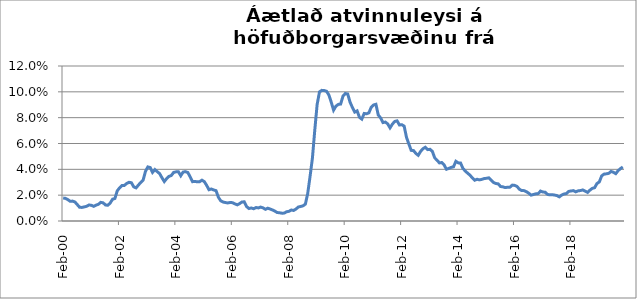
| Category | Series 0 |
|---|---|
| 2000-02-01 | 0.018 |
| 2000-03-01 | 0.018 |
| 2000-04-01 | 0.017 |
| 2000-05-01 | 0.015 |
| 2000-06-01 | 0.015 |
| 2000-07-01 | 0.015 |
| 2000-08-01 | 0.013 |
| 2000-09-01 | 0.011 |
| 2000-10-01 | 0.011 |
| 2000-11-01 | 0.011 |
| 2000-12-01 | 0.011 |
| 2001-01-01 | 0.012 |
| 2001-02-01 | 0.012 |
| 2001-03-01 | 0.011 |
| 2001-04-01 | 0.012 |
| 2001-05-01 | 0.013 |
| 2001-06-01 | 0.014 |
| 2001-07-01 | 0.014 |
| 2001-08-01 | 0.012 |
| 2001-09-01 | 0.012 |
| 2001-10-01 | 0.014 |
| 2001-11-01 | 0.017 |
| 2001-12-01 | 0.017 |
| 2002-01-01 | 0.023 |
| 2002-02-01 | 0.026 |
| 2002-03-01 | 0.028 |
| 2002-04-01 | 0.028 |
| 2002-05-01 | 0.029 |
| 2002-06-01 | 0.03 |
| 2002-07-01 | 0.03 |
| 2002-08-01 | 0.026 |
| 2002-09-01 | 0.026 |
| 2002-10-01 | 0.028 |
| 2002-11-01 | 0.03 |
| 2002-12-01 | 0.032 |
| 2003-01-01 | 0.038 |
| 2003-02-01 | 0.042 |
| 2003-03-01 | 0.041 |
| 2003-04-01 | 0.038 |
| 2003-05-01 | 0.04 |
| 2003-06-01 | 0.038 |
| 2003-07-01 | 0.037 |
| 2003-08-01 | 0.034 |
| 2003-09-01 | 0.031 |
| 2003-10-01 | 0.033 |
| 2003-11-01 | 0.035 |
| 2003-12-01 | 0.035 |
| 2004-01-01 | 0.038 |
| 2004-02-01 | 0.038 |
| 2004-03-01 | 0.038 |
| 2004-04-01 | 0.035 |
| 2004-05-01 | 0.038 |
| 2004-06-01 | 0.038 |
| 2004-07-01 | 0.038 |
| 2004-08-01 | 0.034 |
| 2004-09-01 | 0.03 |
| 2004-10-01 | 0.031 |
| 2004-11-01 | 0.03 |
| 2004-12-01 | 0.03 |
| 2005-01-01 | 0.032 |
| 2005-02-01 | 0.031 |
| 2005-03-01 | 0.028 |
| 2005-04-01 | 0.024 |
| 2005-05-01 | 0.025 |
| 2005-06-01 | 0.024 |
| 2005-07-01 | 0.024 |
| 2005-08-01 | 0.018 |
| 2005-09-01 | 0.016 |
| 2005-10-01 | 0.015 |
| 2005-11-01 | 0.014 |
| 2005-12-01 | 0.014 |
| 2006-01-01 | 0.014 |
| 2006-02-01 | 0.014 |
| 2006-03-01 | 0.013 |
| 2006-04-01 | 0.013 |
| 2006-05-01 | 0.013 |
| 2006-06-01 | 0.015 |
| 2006-07-01 | 0.015 |
| 2006-08-01 | 0.011 |
| 2006-09-01 | 0.01 |
| 2006-10-01 | 0.01 |
| 2006-11-01 | 0.01 |
| 2006-12-01 | 0.01 |
| 2007-01-01 | 0.01 |
| 2007-02-01 | 0.011 |
| 2007-03-01 | 0.01 |
| 2007-04-01 | 0.009 |
| 2007-05-01 | 0.01 |
| 2007-06-01 | 0.009 |
| 2007-07-01 | 0.009 |
| 2007-08-01 | 0.008 |
| 2007-09-01 | 0.007 |
| 2007-10-01 | 0.006 |
| 2007-11-01 | 0.006 |
| 2007-12-01 | 0.006 |
| 2008-01-01 | 0.007 |
| 2008-02-01 | 0.007 |
| 2008-03-01 | 0.009 |
| 2008-04-01 | 0.008 |
| 2008-05-01 | 0.009 |
| 2008-06-01 | 0.011 |
| 2008-07-01 | 0.011 |
| 2008-08-01 | 0.012 |
| 2008-09-01 | 0.013 |
| 2008-10-01 | 0.021 |
| 2008-11-01 | 0.035 |
| 2008-12-01 | 0.049 |
| 2009-01-01 | 0.07 |
| 2009-02-01 | 0.09 |
| 2009-03-01 | 0.1 |
| 2009-04-01 | 0.101 |
| 2009-05-01 | 0.101 |
| 2009-06-01 | 0.1 |
| 2009-07-01 | 0.098 |
| 2009-08-01 | 0.092 |
| 2009-09-01 | 0.086 |
| 2009-10-01 | 0.089 |
| 2009-11-01 | 0.09 |
| 2009-12-01 | 0.091 |
| 2010-01-01 | 0.097 |
| 2010-02-01 | 0.099 |
| 2010-03-01 | 0.098 |
| 2010-04-01 | 0.092 |
| 2010-05-01 | 0.088 |
| 2010-06-01 | 0.084 |
| 2010-07-01 | 0.085 |
| 2010-08-01 | 0.08 |
| 2010-09-01 | 0.079 |
| 2010-10-01 | 0.083 |
| 2010-11-01 | 0.083 |
| 2010-12-01 | 0.084 |
| 2011-01-01 | 0.088 |
| 2011-02-01 | 0.09 |
| 2011-03-01 | 0.09 |
| 2011-04-01 | 0.082 |
| 2011-05-01 | 0.08 |
| 2011-06-01 | 0.076 |
| 2011-07-01 | 0.077 |
| 2011-08-01 | 0.075 |
| 2011-09-01 | 0.072 |
| 2011-10-01 | 0.075 |
| 2011-11-01 | 0.077 |
| 2011-12-01 | 0.078 |
| 2012-01-01 | 0.074 |
| 2012-02-01 | 0.075 |
| 2012-03-01 | 0.073 |
| 2012-04-01 | 0.065 |
| 2012-05-01 | 0.06 |
| 2012-06-01 | 0.055 |
| 2012-07-01 | 0.054 |
| 2012-08-01 | 0.052 |
| 2012-09-01 | 0.051 |
| 2012-10-01 | 0.054 |
| 2012-11-01 | 0.056 |
| 2012-12-01 | 0.057 |
| 2013-01-01 | 0.055 |
| 2013-02-01 | 0.055 |
| 2013-03-01 | 0.054 |
| 2013-04-01 | 0.049 |
| 2013-05-01 | 0.047 |
| 2013-06-01 | 0.045 |
| 2013-07-01 | 0.045 |
| 2013-08-01 | 0.043 |
| 2013-09-01 | 0.04 |
| 2013-10-01 | 0.041 |
| 2013-11-01 | 0.041 |
| 2013-12-01 | 0.042 |
| 2014-01-01 | 0.046 |
| 2014-02-01 | 0.045 |
| 2014-03-01 | 0.045 |
| 2014-04-01 | 0.041 |
| 2014-05-01 | 0.039 |
| 2014-06-01 | 0.037 |
| 2014-07-01 | 0.036 |
| 2014-08-01 | 0.033 |
| 2014-09-01 | 0.032 |
| 2014-10-01 | 0.032 |
| 2014-11-01 | 0.032 |
| 2014-12-01 | 0.032 |
| 2015-01-01 | 0.033 |
| 2015-02-01 | 0.033 |
| 2015-03-01 | 0.033 |
| 2015-04-01 | 0.032 |
| 2015-05-01 | 0.03 |
| 2015-06-01 | 0.029 |
| 2015-07-01 | 0.029 |
| 2015-08-01 | 0.027 |
| 2015-09-01 | 0.026 |
| 2015-10-01 | 0.026 |
| 2015-11-01 | 0.026 |
| 2015-12-01 | 0.026 |
| 2016-01-01 | 0.028 |
| 2016-02-01 | 0.028 |
| 2016-03-01 | 0.027 |
| 2016-04-01 | 0.025 |
| 2016-05-01 | 0.024 |
| 2016-06-01 | 0.024 |
| 2016-07-01 | 0.023 |
| 2016-08-01 | 0.022 |
| 2016-09-01 | 0.02 |
| 2016-10-01 | 0.021 |
| 2016-11-01 | 0.021 |
| 2016-12-01 | 0.021 |
| 2017-01-01 | 0.023 |
| 2017-02-01 | 0.022 |
| 2017-03-01 | 0.022 |
| 2017-04-01 | 0.021 |
| 2017-05-01 | 0.02 |
| 2017-06-01 | 0.02 |
| 2017-07-01 | 0.02 |
| 2017-08-01 | 0.02 |
| 2017-09-01 | 0.019 |
| 2017-10-01 | 0.02 |
| 2017-11-01 | 0.021 |
| 2017-12-01 | 0.021 |
| 2018-01-01 | 0.023 |
| 2018-02-01 | 0.023 |
| 2018-03-01 | 0.024 |
| 2018-04-01 | 0.023 |
| 2018-05-01 | 0.023 |
| 2018-06-01 | 0.024 |
| 2018-07-01 | 0.024 |
| 2018-08-01 | 0.023 |
| 2018-09-01 | 0.022 |
| 2018-10-01 | 0.024 |
| 2018-11-01 | 0.025 |
| 2018-12-01 | 0.026 |
| 2019-01-01 | 0.029 |
| 2019-02-01 | 0.03 |
| 2019-03-01 | 0.035 |
| 2019-04-01 | 0.036 |
| 2019-05-01 | 0.037 |
| 2019-06-01 | 0.037 |
| 2019-07-01 | 0.038 |
| 2019-08-01 | 0.038 |
| 2019-09-01 | 0.037 |
| 2019-10-01 | 0.039 |
| 2019-11-01 | 0.041 |
| 2019-12-01 | 0.042 |